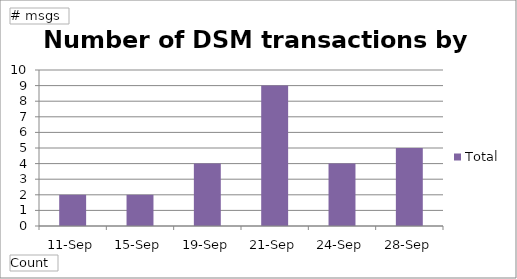
| Category | Total |
|---|---|
| 11-Sep | 2 |
| 15-Sep | 2 |
| 19-Sep | 4 |
| 21-Sep | 9 |
| 24-Sep | 4 |
| 28-Sep | 5 |